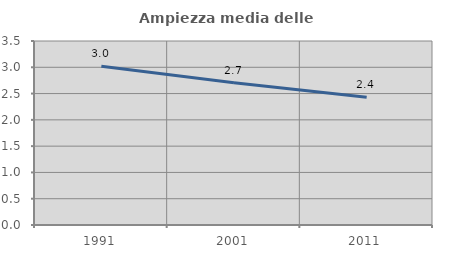
| Category | Ampiezza media delle famiglie |
|---|---|
| 1991.0 | 3.02 |
| 2001.0 | 2.708 |
| 2011.0 | 2.429 |